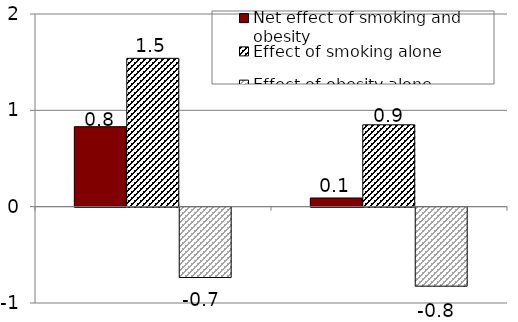
| Category | Net effect of smoking and obesity | Effect of smoking alone | Effect of obesity alone |
|---|---|---|---|
|  | 0.83 | 1.54 | -0.73 |
|  | 0.09 | 0.85 | -0.82 |